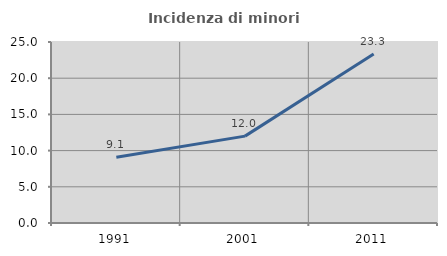
| Category | Incidenza di minori stranieri |
|---|---|
| 1991.0 | 9.091 |
| 2001.0 | 12 |
| 2011.0 | 23.333 |